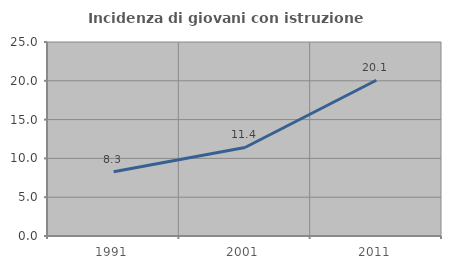
| Category | Incidenza di giovani con istruzione universitaria |
|---|---|
| 1991.0 | 8.291 |
| 2001.0 | 11.407 |
| 2011.0 | 20.071 |